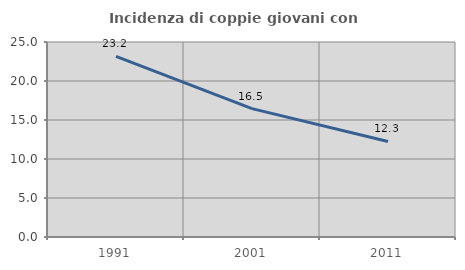
| Category | Incidenza di coppie giovani con figli |
|---|---|
| 1991.0 | 23.152 |
| 2001.0 | 16.456 |
| 2011.0 | 12.252 |